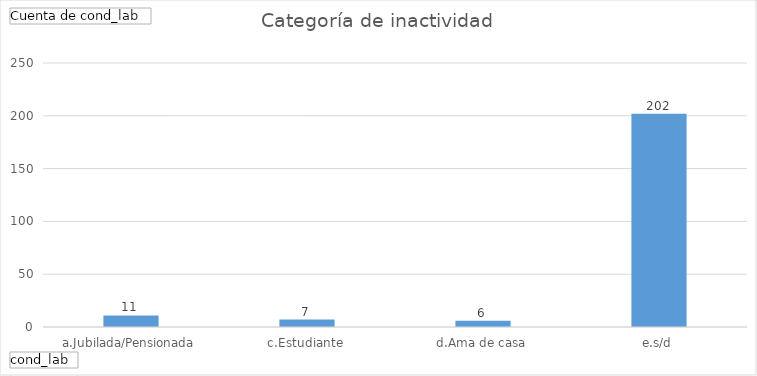
| Category | Total |
|---|---|
| a.Jubilada/Pensionada | 11 |
| c.Estudiante | 7 |
| d.Ama de casa | 6 |
| e.s/d | 202 |